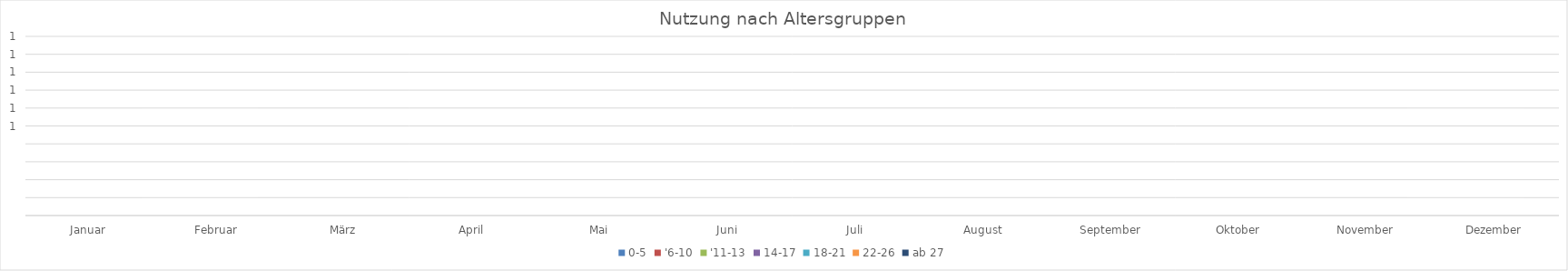
| Category | 0-5 | '6-10 | '11-13 | 14-17 | 18-21 | 22-26 | ab 27 |
|---|---|---|---|---|---|---|---|
| Januar | 0 | 0 | 0 | 0 | 0 | 0 | 0 |
| Februar | 0 | 0 | 0 | 0 | 0 | 0 | 0 |
| März | 0 | 0 | 0 | 0 | 0 | 0 | 0 |
| April | 0 | 0 | 0 | 0 | 0 | 0 | 0 |
| Mai | 0 | 0 | 0 | 0 | 0 | 0 | 0 |
| Juni | 0 | 0 | 0 | 0 | 0 | 0 | 0 |
| Juli | 0 | 0 | 0 | 0 | 0 | 0 | 0 |
| August | 0 | 0 | 0 | 0 | 0 | 0 | 0 |
| September | 0 | 0 | 0 | 0 | 0 | 0 | 0 |
| Oktober | 0 | 0 | 0 | 0 | 0 | 0 | 0 |
| November | 0 | 0 | 0 | 0 | 0 | 0 | 0 |
| Dezember | 0 | 0 | 0 | 0 | 0 | 0 | 0 |